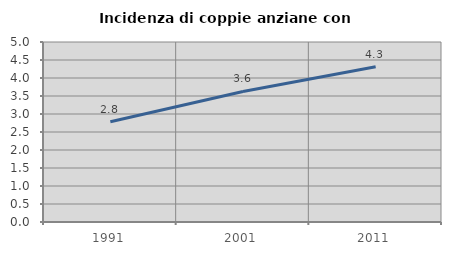
| Category | Incidenza di coppie anziane con figli |
|---|---|
| 1991.0 | 2.785 |
| 2001.0 | 3.625 |
| 2011.0 | 4.312 |